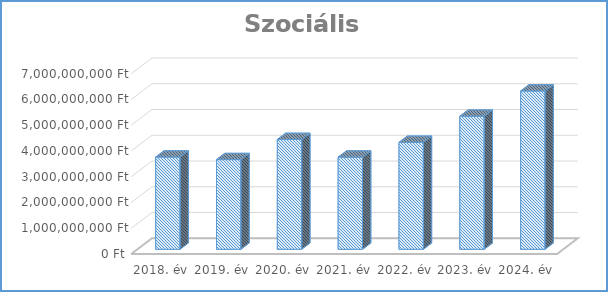
| Category | Szociális védelem |
|---|---|
| 2018. év | 3579929600 |
| 2019. év | 3482496800 |
| 2020. év | 4264639734 |
| 2021. év | 3577072636 |
| 2022. év | 4152938340 |
| 2023. év | 5166919629 |
| 2024. év | 6146299852 |